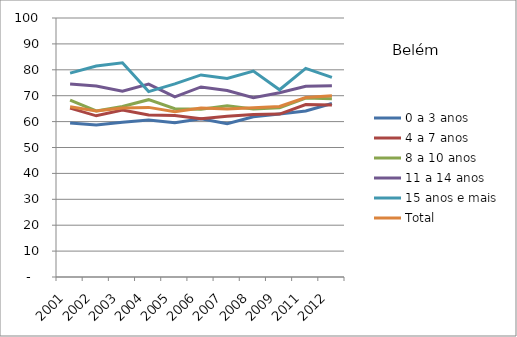
| Category | 0 a 3 anos | 4 a 7 anos | 8 a 10 anos | 11 a 14 anos | 15 anos e mais | Total |
|---|---|---|---|---|---|---|
| 2001.0 | 59.46 | 65.22 | 68.29 | 74.48 | 78.72 | 65.74 |
| 2002.0 | 58.68 | 62.23 | 64.11 | 73.78 | 81.43 | 64.14 |
| 2003.0 | 59.75 | 64.46 | 65.82 | 71.72 | 82.72 | 65.22 |
| 2004.0 | 60.64 | 62.58 | 68.46 | 74.47 | 71.58 | 65.49 |
| 2005.0 | 59.6 | 62.34 | 64.96 | 69.57 | 74.57 | 63.8 |
| 2006.0 | 61.12 | 61.15 | 64.76 | 73.39 | 78.01 | 65.24 |
| 2007.0 | 59.21 | 62.03 | 66.1 | 71.98 | 76.62 | 64.88 |
| 2008.0 | 61.86 | 62.7 | 64.9 | 69.23 | 79.51 | 65.38 |
| 2009.0 | 62.91 | 62.89 | 65.33 | 71.11 | 72.29 | 65.84 |
| 2011.0 | 64.13 | 66.56 | 69.09 | 73.61 | 80.53 | 69.28 |
| 2012.0 | 66.97 | 66.44 | 68.87 | 73.8 | 77.1 | 69.99 |